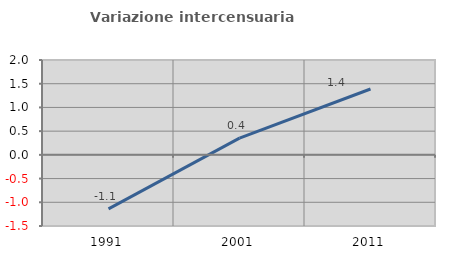
| Category | Variazione intercensuaria annua |
|---|---|
| 1991.0 | -1.138 |
| 2001.0 | 0.352 |
| 2011.0 | 1.388 |